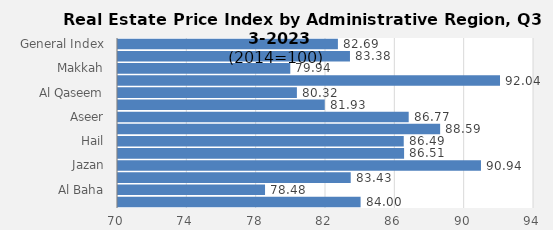
| Category | 2023 |
|---|---|
| General Index | 82.687 |
| Riyadh | 83.383 |
| Makkah | 79.94 |
| Madinah | 92.039 |
| Al Qaseem | 80.321 |
| Eastern Province | 81.928 |
| Aseer | 86.771 |
| Tabouk | 88.585 |
| Hail | 86.485 |
| Northern Borders | 86.505 |
| Jazan | 90.941 |
| Najran | 83.426 |
| Al Baha | 78.483 |
| Al Jouf | 83.996 |